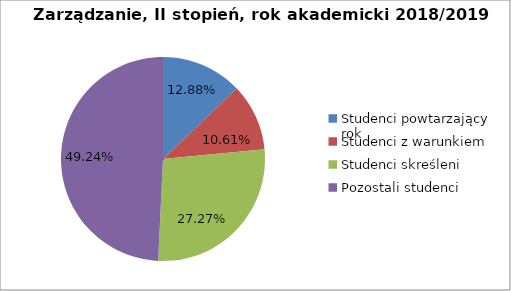
| Category | Series 0 |
|---|---|
| Studenci powtarzający rok | 17 |
| Studenci z warunkiem | 14 |
| Studenci skreśleni | 36 |
| Pozostali studenci | 65 |